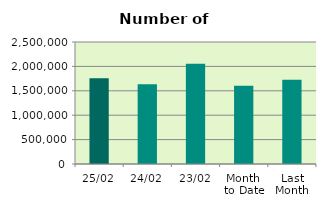
| Category | Series 0 |
|---|---|
| 25/02 | 1759054 |
| 24/02 | 1635906 |
| 23/02 | 2054162 |
| Month 
to Date | 1605690.421 |
| Last
Month | 1728874.4 |